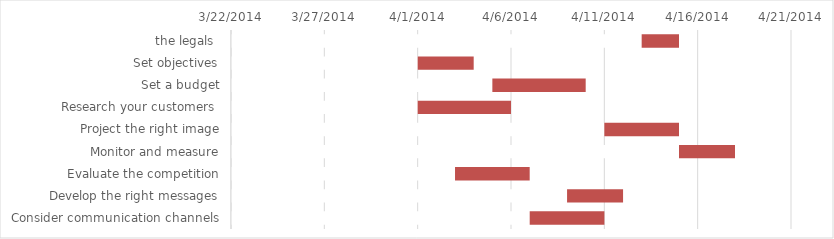
| Category | Sum of Start Date | Sum of Duration |
|---|---|---|
| the legals  | 41742 | 2 |
| Set objectives | 41730 | 3 |
| Set a budget | 41734 | 5 |
| Research your customers  | 41730 | 5 |
| Project the right image | 41740 | 4 |
| Monitor and measure | 41744 | 3 |
| Evaluate the competition | 41732 | 4 |
| Develop the right messages | 41738 | 3 |
| Consider communication channels | 41736 | 4 |